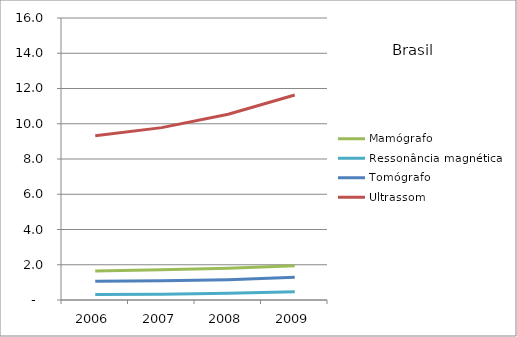
| Category | Mamógrafo | Ressonância magnética | Tomógrafo | Ultrassom |
|---|---|---|---|---|
| 2006.0 | 1.65 | 0.31 | 1.06 | 9.32 |
| 2007.0 | 1.72 | 0.33 | 1.09 | 9.78 |
| 2008.0 | 1.8 | 0.38 | 1.15 | 10.54 |
| 2009.0 | 1.94 | 0.47 | 1.29 | 11.63 |